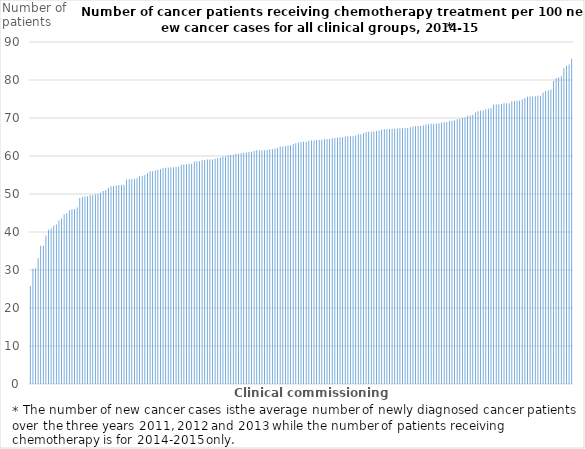
| Category | Series 0 |
|---|---|
| 0 | 25.769 |
| 1 | 30.306 |
| 2 | 30.437 |
| 3 | 33.188 |
| 4 | 36.351 |
| 5 | 36.412 |
| 6 | 39.046 |
| 7 | 40.588 |
| 8 | 40.891 |
| 9 | 41.691 |
| 10 | 41.984 |
| 11 | 43.036 |
| 12 | 43.54 |
| 13 | 44.672 |
| 14 | 44.957 |
| 15 | 45.713 |
| 16 | 45.996 |
| 17 | 46.069 |
| 18 | 46.457 |
| 19 | 48.945 |
| 20 | 49.191 |
| 21 | 49.336 |
| 22 | 49.395 |
| 23 | 49.64 |
| 24 | 49.766 |
| 25 | 49.887 |
| 26 | 50 |
| 27 | 50.359 |
| 28 | 50.762 |
| 29 | 51.03 |
| 30 | 51.655 |
| 31 | 52.065 |
| 32 | 52.09 |
| 33 | 52.246 |
| 34 | 52.351 |
| 35 | 52.381 |
| 36 | 52.438 |
| 37 | 53.846 |
| 38 | 53.882 |
| 39 | 53.91 |
| 40 | 53.988 |
| 41 | 54.148 |
| 42 | 54.68 |
| 43 | 54.794 |
| 44 | 54.968 |
| 45 | 55.469 |
| 46 | 55.982 |
| 47 | 55.997 |
| 48 | 56.266 |
| 49 | 56.39 |
| 50 | 56.501 |
| 51 | 56.776 |
| 52 | 56.925 |
| 53 | 56.95 |
| 54 | 56.976 |
| 55 | 57.072 |
| 56 | 57.126 |
| 57 | 57.178 |
| 58 | 57.723 |
| 59 | 57.811 |
| 60 | 57.825 |
| 61 | 57.983 |
| 62 | 57.989 |
| 63 | 58.54 |
| 64 | 58.553 |
| 65 | 58.615 |
| 66 | 58.886 |
| 67 | 58.953 |
| 68 | 59.054 |
| 69 | 59.089 |
| 70 | 59.089 |
| 71 | 59.286 |
| 72 | 59.464 |
| 73 | 59.527 |
| 74 | 59.806 |
| 75 | 59.855 |
| 76 | 60.191 |
| 77 | 60.291 |
| 78 | 60.361 |
| 79 | 60.61 |
| 80 | 60.621 |
| 81 | 60.742 |
| 82 | 60.88 |
| 83 | 60.911 |
| 84 | 61.023 |
| 85 | 61.125 |
| 86 | 61.297 |
| 87 | 61.49 |
| 88 | 61.491 |
| 89 | 61.512 |
| 90 | 61.543 |
| 91 | 61.555 |
| 92 | 61.765 |
| 93 | 61.791 |
| 94 | 61.96 |
| 95 | 62.077 |
| 96 | 62.487 |
| 97 | 62.52 |
| 98 | 62.594 |
| 99 | 62.762 |
| 100 | 62.819 |
| 101 | 63.146 |
| 102 | 63.345 |
| 103 | 63.583 |
| 104 | 63.674 |
| 105 | 63.719 |
| 106 | 63.728 |
| 107 | 64.023 |
| 108 | 64.054 |
| 109 | 64.101 |
| 110 | 64.192 |
| 111 | 64.203 |
| 112 | 64.277 |
| 113 | 64.39 |
| 114 | 64.456 |
| 115 | 64.503 |
| 116 | 64.653 |
| 117 | 64.768 |
| 118 | 64.786 |
| 119 | 64.952 |
| 120 | 64.959 |
| 121 | 65.15 |
| 122 | 65.183 |
| 123 | 65.202 |
| 124 | 65.205 |
| 125 | 65.406 |
| 126 | 65.713 |
| 127 | 65.748 |
| 128 | 65.99 |
| 129 | 66.327 |
| 130 | 66.355 |
| 131 | 66.389 |
| 132 | 66.443 |
| 133 | 66.584 |
| 134 | 66.641 |
| 135 | 67.005 |
| 136 | 67.028 |
| 137 | 67.039 |
| 138 | 67.089 |
| 139 | 67.144 |
| 140 | 67.179 |
| 141 | 67.288 |
| 142 | 67.291 |
| 143 | 67.297 |
| 144 | 67.35 |
| 145 | 67.374 |
| 146 | 67.573 |
| 147 | 67.746 |
| 148 | 67.801 |
| 149 | 67.879 |
| 150 | 67.905 |
| 151 | 68.029 |
| 152 | 68.307 |
| 153 | 68.371 |
| 154 | 68.495 |
| 155 | 68.503 |
| 156 | 68.571 |
| 157 | 68.592 |
| 158 | 68.816 |
| 159 | 68.858 |
| 160 | 68.967 |
| 161 | 69.159 |
| 162 | 69.287 |
| 163 | 69.426 |
| 164 | 69.698 |
| 165 | 69.758 |
| 166 | 69.989 |
| 167 | 70.107 |
| 168 | 70.566 |
| 169 | 70.655 |
| 170 | 70.869 |
| 171 | 71.47 |
| 172 | 71.788 |
| 173 | 71.955 |
| 174 | 71.991 |
| 175 | 72.283 |
| 176 | 72.451 |
| 177 | 72.645 |
| 178 | 73.552 |
| 179 | 73.554 |
| 180 | 73.645 |
| 181 | 73.667 |
| 182 | 73.867 |
| 183 | 73.889 |
| 184 | 73.908 |
| 185 | 74.401 |
| 186 | 74.457 |
| 187 | 74.562 |
| 188 | 74.637 |
| 189 | 74.965 |
| 190 | 75.267 |
| 191 | 75.597 |
| 192 | 75.641 |
| 193 | 75.669 |
| 194 | 75.728 |
| 195 | 75.826 |
| 196 | 75.887 |
| 197 | 76.729 |
| 198 | 77.122 |
| 199 | 77.269 |
| 200 | 77.493 |
| 201 | 79.755 |
| 202 | 80.517 |
| 203 | 80.741 |
| 204 | 81.022 |
| 205 | 83.145 |
| 206 | 83.748 |
| 207 | 84.095 |
| 208 | 85.565 |